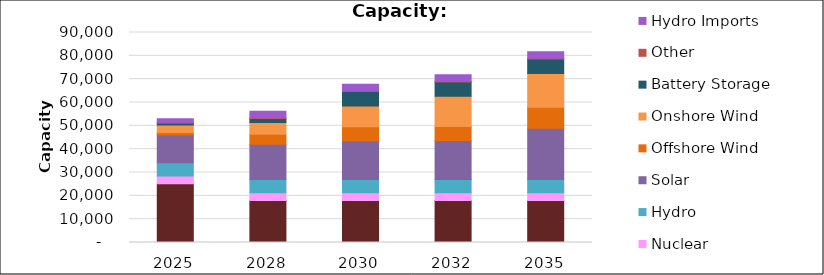
| Category | Gas & FO | Zero-Carbon Firm Resources | Nuclear | Hydro | Solar | Offshore Wind | Onshore Wind | Battery Storage | Other | Hydro Imports |
|---|---|---|---|---|---|---|---|---|---|---|
| 2025.0 | 25145.8 | 0 | 3333.6 | 5704.75 | 11986.19 | 924 | 3297.24 | 676.5 | 475.95 | 1485 |
| 2028.0 | 17970.29 | 0 | 3333.6 | 5704.75 | 15128.35 | 4300 | 4966.44 | 1711.5 | 369.65 | 2735 |
| 2030.0 | 17961.35 | 0 | 3333.6 | 5704.75 | 16564.35 | 6000 | 8966.44 | 6150 | 369.65 | 2735 |
| 2032.0 | 17961.35 | 0 | 3333.6 | 5704.75 | 16666.46 | 6000 | 12966.44 | 6150 | 369.65 | 2735 |
| 2035.0 | 17961.35 | 0 | 3333.6 | 5704.75 | 22006.55 | 9000 | 14443.44 | 6150 | 369.65 | 2735 |